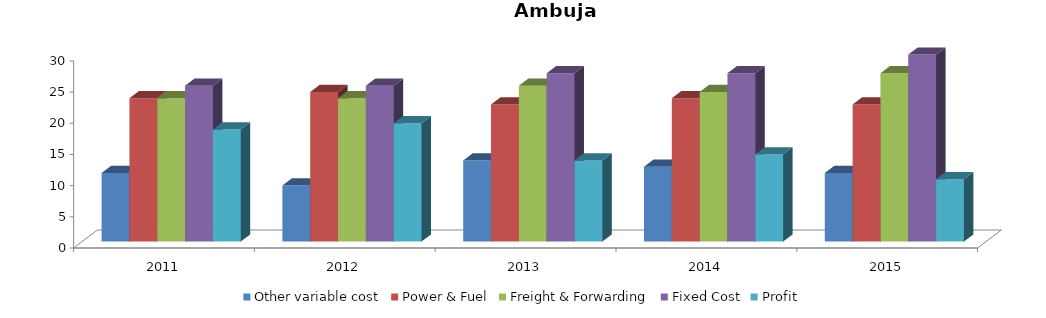
| Category | Other variable cost | Power & Fuel | Freight & Forwarding | Fixed Cost | Profit |
|---|---|---|---|---|---|
| 2011 | 11 | 23 | 23 | 25 | 18 |
| 2012 | 9 | 24 | 23 | 25 | 19 |
| 2013 | 13 | 22 | 25 | 27 | 13 |
| 2014 | 12 | 23 | 24 | 27 | 14 |
| 2015 | 11 | 22 | 27 | 30 | 10 |